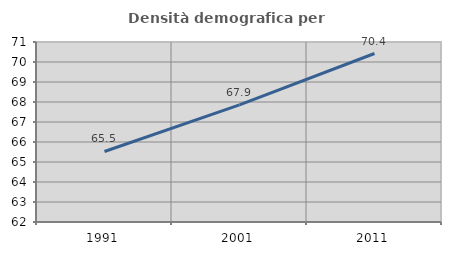
| Category | Densità demografica |
|---|---|
| 1991.0 | 65.527 |
| 2001.0 | 67.859 |
| 2011.0 | 70.424 |